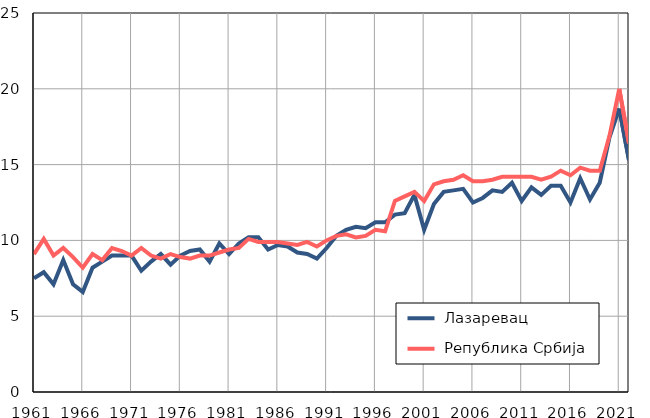
| Category |  Лазаревац |  Република Србија |
|---|---|---|
| 1961.0 | 7.5 | 9.1 |
| 1962.0 | 7.9 | 10.1 |
| 1963.0 | 7.1 | 9 |
| 1964.0 | 8.7 | 9.5 |
| 1965.0 | 7.1 | 8.9 |
| 1966.0 | 6.6 | 8.2 |
| 1967.0 | 8.2 | 9.1 |
| 1968.0 | 8.6 | 8.7 |
| 1969.0 | 9 | 9.5 |
| 1970.0 | 9 | 9.3 |
| 1971.0 | 9 | 9 |
| 1972.0 | 8 | 9.5 |
| 1973.0 | 8.6 | 9 |
| 1974.0 | 9.1 | 8.8 |
| 1975.0 | 8.4 | 9.1 |
| 1976.0 | 9 | 8.9 |
| 1977.0 | 9.3 | 8.8 |
| 1978.0 | 9.4 | 9 |
| 1979.0 | 8.6 | 9 |
| 1980.0 | 9.8 | 9.2 |
| 1981.0 | 9.1 | 9.4 |
| 1982.0 | 9.8 | 9.5 |
| 1983.0 | 10.2 | 10.1 |
| 1984.0 | 10.2 | 9.9 |
| 1985.0 | 9.4 | 9.9 |
| 1986.0 | 9.7 | 9.9 |
| 1987.0 | 9.6 | 9.8 |
| 1988.0 | 9.2 | 9.7 |
| 1989.0 | 9.1 | 9.9 |
| 1990.0 | 8.8 | 9.6 |
| 1991.0 | 9.5 | 10 |
| 1992.0 | 10.3 | 10.3 |
| 1993.0 | 10.7 | 10.4 |
| 1994.0 | 10.9 | 10.2 |
| 1995.0 | 10.8 | 10.3 |
| 1996.0 | 11.2 | 10.7 |
| 1997.0 | 11.2 | 10.6 |
| 1998.0 | 11.7 | 12.6 |
| 1999.0 | 11.8 | 12.9 |
| 2000.0 | 13 | 13.2 |
| 2001.0 | 10.7 | 12.6 |
| 2002.0 | 12.4 | 13.7 |
| 2003.0 | 13.2 | 13.9 |
| 2004.0 | 13.3 | 14 |
| 2005.0 | 13.4 | 14.3 |
| 2006.0 | 12.5 | 13.9 |
| 2007.0 | 12.8 | 13.9 |
| 2008.0 | 13.3 | 14 |
| 2009.0 | 13.2 | 14.2 |
| 2010.0 | 13.8 | 14.2 |
| 2011.0 | 12.6 | 14.2 |
| 2012.0 | 13.5 | 14.2 |
| 2013.0 | 13 | 14 |
| 2014.0 | 13.6 | 14.2 |
| 2015.0 | 13.6 | 14.6 |
| 2016.0 | 12.5 | 14.3 |
| 2017.0 | 14.1 | 14.8 |
| 2018.0 | 12.7 | 14.6 |
| 2019.0 | 13.8 | 14.6 |
| 2020.0 | 16.8 | 16.9 |
| 2021.0 | 18.7 | 20 |
| 2022.0 | 15.3 | 16.4 |